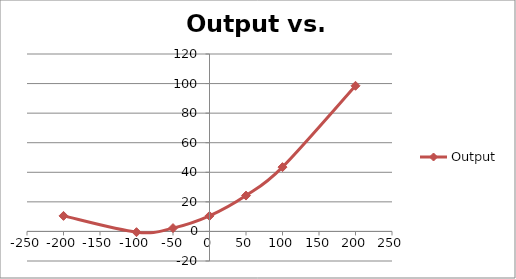
| Category | Output |
|---|---|
| -200.0 | 10.5 |
| -100.0 | -0.5 |
| -50.0 | 2.25 |
| 0.0 | 10.5 |
| 50.0 | 24.25 |
| 100.0 | 43.5 |
| 200.0 | 98.5 |